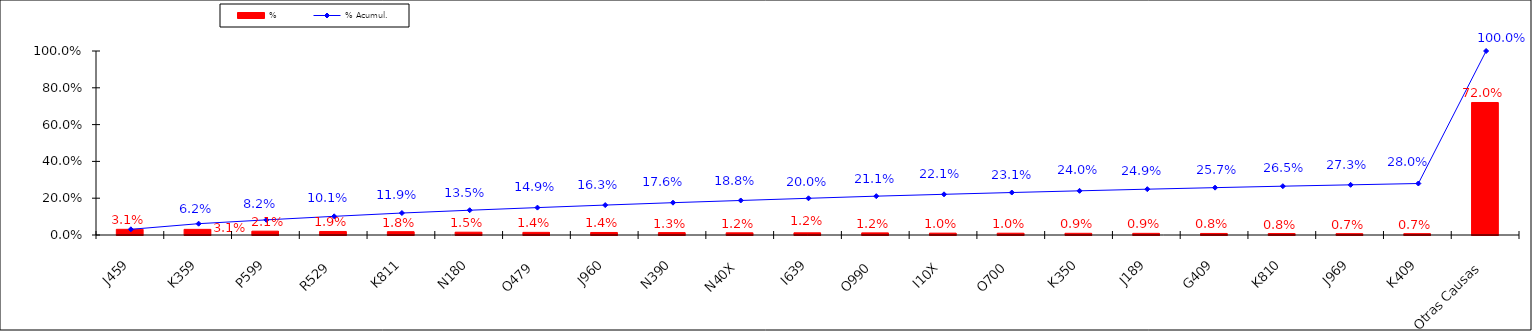
| Category | % |
|---|---|
| J459 | 0.031 |
| K359 | 0.031 |
| P599 | 0.021 |
| R529 | 0.019 |
| K811 | 0.018 |
| N180 | 0.015 |
| O479 | 0.014 |
| J960 | 0.014 |
| N390 | 0.013 |
| N40X | 0.012 |
| I639 | 0.012 |
| O990 | 0.012 |
| I10X | 0.01 |
| O700 | 0.01 |
| K350 | 0.009 |
| J189 | 0.009 |
| G409 | 0.008 |
| K810 | 0.008 |
| J969 | 0.007 |
| K409 | 0.007 |
| Otras Causas | 0.72 |